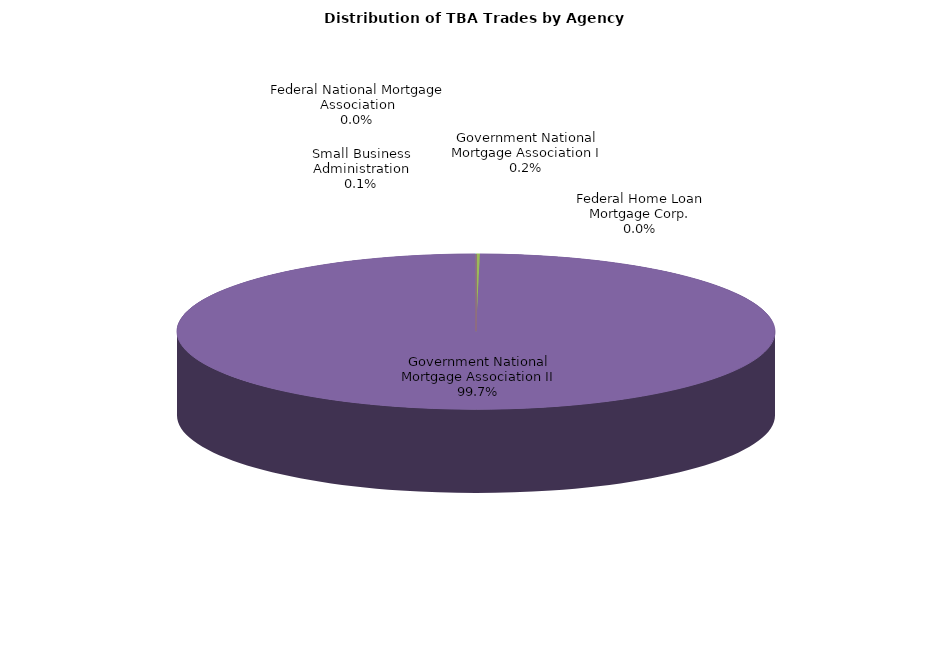
| Category | Series 0 |
|---|---|
| Federal Home Loan Mortgage Corp. | 0 |
| Federal National Mortgage Association | 0 |
| Government National Mortgage Association I | 4 |
| Government National Mortgage Association II | 1902.524 |
| Small Business Administration | 1 |